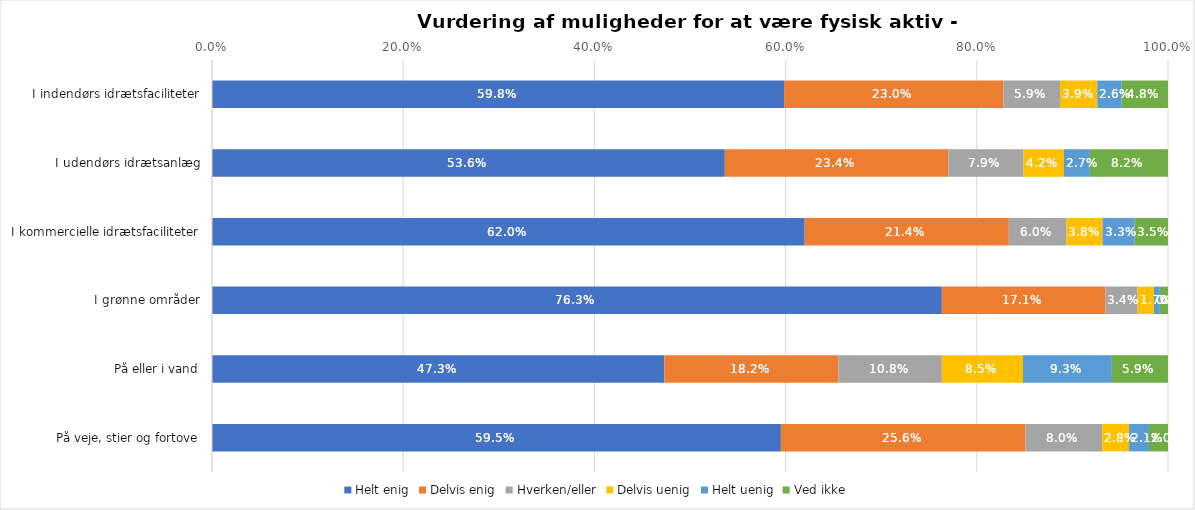
| Category | Helt enig | Delvis enig | Hverken/eller | Delvis uenig | Helt uenig | Ved ikke |
|---|---|---|---|---|---|---|
| I indendørs idrætsfaciliteter | 0.598 | 0.23 | 0.059 | 0.039 | 0.026 | 0.048 |
| I udendørs idrætsanlæg | 0.536 | 0.234 | 0.079 | 0.042 | 0.027 | 0.082 |
| I kommercielle idrætsfaciliteter | 0.62 | 0.214 | 0.06 | 0.038 | 0.033 | 0.035 |
| I grønne områder | 0.763 | 0.171 | 0.034 | 0.017 | 0.006 | 0.008 |
| På eller i vand | 0.473 | 0.182 | 0.108 | 0.085 | 0.093 | 0.059 |
| På veje, stier og fortove | 0.595 | 0.256 | 0.08 | 0.028 | 0.021 | 0.02 |